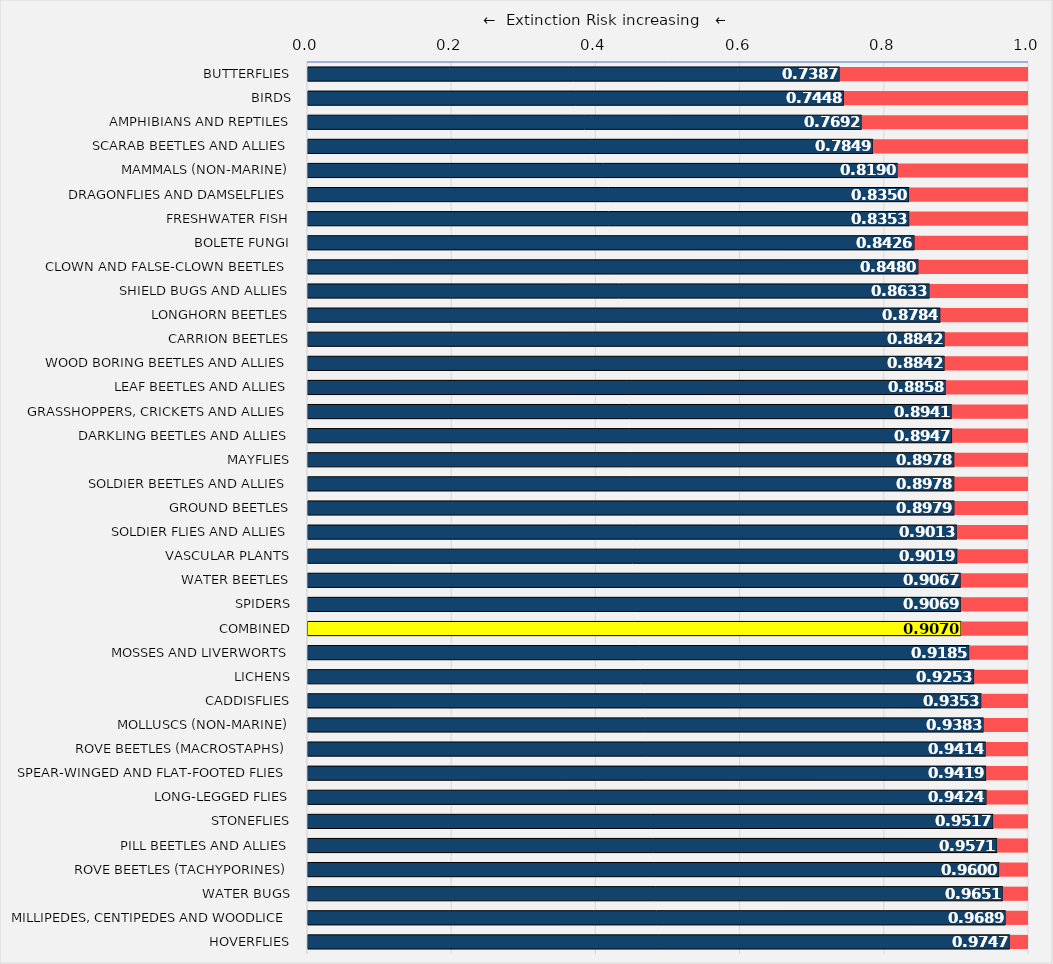
| Category | RLI baseline | Difference to max. |
|---|---|---|
| Butterflies | 0.739 | 0.261 |
| Birds | 0.745 | 0.255 |
| Amphibians and reptiles | 0.769 | 0.231 |
| Scarab beetles and allies | 0.785 | 0.215 |
| Mammals (non-marine) | 0.819 | 0.181 |
| Dragonflies and damselflies | 0.835 | 0.165 |
| Freshwater Fish | 0.835 | 0.165 |
| Bolete fungi | 0.843 | 0.157 |
| Clown and False-clown beetles | 0.848 | 0.152 |
| Shield bugs and allies | 0.863 | 0.137 |
| Longhorn beetles | 0.878 | 0.122 |
| Carrion beetles | 0.884 | 0.116 |
| Wood boring beetles and allies | 0.884 | 0.116 |
| Leaf beetles and allies | 0.886 | 0.114 |
| Grasshoppers, crickets and allies | 0.894 | 0.106 |
| Darkling beetles and allies | 0.895 | 0.105 |
| Mayflies | 0.898 | 0.102 |
| Soldier beetles and allies | 0.898 | 0.102 |
| Ground beetles | 0.898 | 0.102 |
| Soldier flies and allies | 0.901 | 0.099 |
| Vascular plants | 0.902 | 0.098 |
| Water beetles | 0.907 | 0.093 |
| Spiders | 0.907 | 0.093 |
| COMBINED | 0.907 | 0.093 |
| Mosses and liverworts | 0.918 | 0.082 |
| Lichens | 0.925 | 0.075 |
| Caddisflies | 0.935 | 0.065 |
| Molluscs (non-marine) | 0.938 | 0.062 |
| Rove beetles (macrostaphs) | 0.941 | 0.059 |
| Spear-winged and Flat-footed flies | 0.942 | 0.058 |
| Long-legged flies | 0.942 | 0.058 |
| Stoneflies | 0.952 | 0.048 |
| Pill beetles and allies | 0.957 | 0.043 |
| Rove beetles (tachyporines) | 0.96 | 0.04 |
| Water bugs | 0.965 | 0.035 |
| Millipedes, centipedes and woodlice | 0.969 | 0.031 |
| Hoverflies | 0.975 | 0.025 |